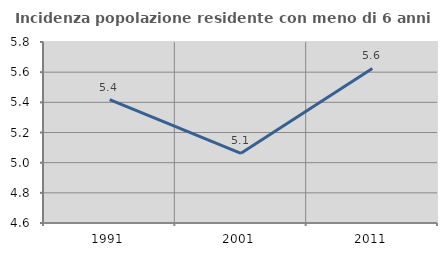
| Category | Incidenza popolazione residente con meno di 6 anni |
|---|---|
| 1991.0 | 5.418 |
| 2001.0 | 5.062 |
| 2011.0 | 5.625 |